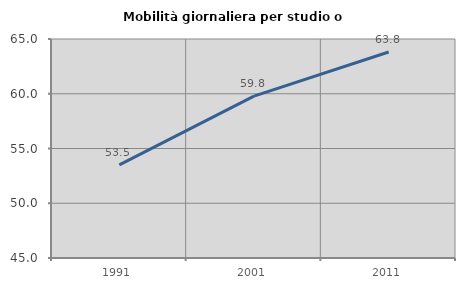
| Category | Mobilità giornaliera per studio o lavoro |
|---|---|
| 1991.0 | 53.505 |
| 2001.0 | 59.78 |
| 2011.0 | 63.813 |